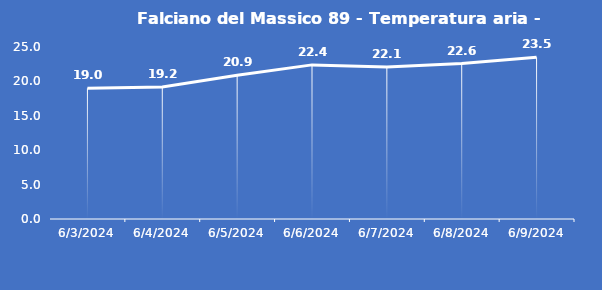
| Category | Falciano del Massico 89 - Temperatura aria - Grezzo (°C) |
|---|---|
| 6/3/24 | 19 |
| 6/4/24 | 19.2 |
| 6/5/24 | 20.9 |
| 6/6/24 | 22.4 |
| 6/7/24 | 22.1 |
| 6/8/24 | 22.6 |
| 6/9/24 | 23.5 |